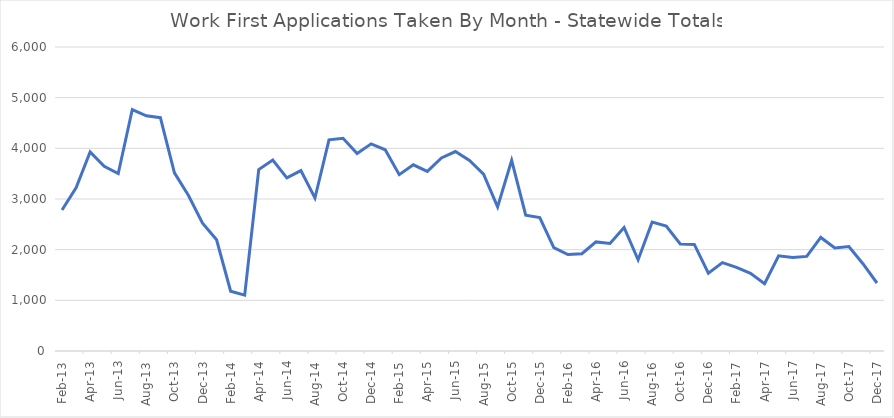
| Category | Series 0 |
|---|---|
| 2017-12-01 | 1342 |
| 2017-11-01 | 1723 |
| 2017-10-01 | 2062 |
| 2017-09-01 | 2033 |
| 2017-08-01 | 2241 |
| 2017-07-01 | 1867 |
| 2017-06-01 | 1846 |
| 2017-05-01 | 1878 |
| 2017-04-01 | 1327 |
| 2017-03-01 | 1532 |
| 2017-02-01 | 1649 |
| 2017-01-01 | 1744 |
| 2016-12-01 | 1534 |
| 2016-11-01 | 2103 |
| 2016-10-01 | 2113 |
| 2016-09-01 | 2468 |
| 2016-08-01 | 2547 |
| 2016-07-01 | 1799 |
| 2016-06-01 | 2437 |
| 2016-05-01 | 2121 |
| 2016-04-01 | 2153 |
| 2016-03-01 | 1919 |
| 2016-02-01 | 1903 |
| 2016-01-01 | 2041 |
| 2015-12-01 | 2633 |
| 2015-11-01 | 2682 |
| 2015-10-01 | 3763 |
| 2015-09-01 | 2843 |
| 2015-08-01 | 3492 |
| 2015-07-01 | 3760 |
| 2015-06-01 | 3936 |
| 2015-05-01 | 3809 |
| 2015-04-01 | 3545 |
| 2015-03-01 | 3675 |
| 2015-02-01 | 3481 |
| 2015-01-01 | 3972 |
| 2014-12-01 | 4088 |
| 2014-11-01 | 3898 |
| 2014-10-01 | 4199 |
| 2014-09-01 | 4168 |
| 2014-08-01 | 3019 |
| 2014-07-01 | 3561 |
| 2014-06-01 | 3417 |
| 2014-05-01 | 3770 |
| 2014-04-01 | 3582 |
| 2014-03-01 | 1103 |
| 2014-02-01 | 1179 |
| 2014-01-01 | 2196 |
| 2013-12-01 | 2522 |
| 2013-11-01 | 3069 |
| 2013-10-01 | 3517 |
| 2013-09-01 | 4605 |
| 2013-08-01 | 4641 |
| 2013-07-01 | 4766 |
| 2013-06-01 | 3502 |
| 2013-05-01 | 3645 |
| 2013-04-01 | 3928 |
| 2013-03-01 | 3220 |
| 2013-02-01 | 2783 |